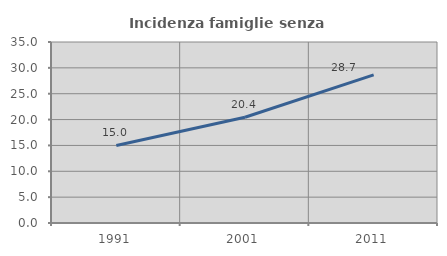
| Category | Incidenza famiglie senza nuclei |
|---|---|
| 1991.0 | 14.995 |
| 2001.0 | 20.444 |
| 2011.0 | 28.654 |